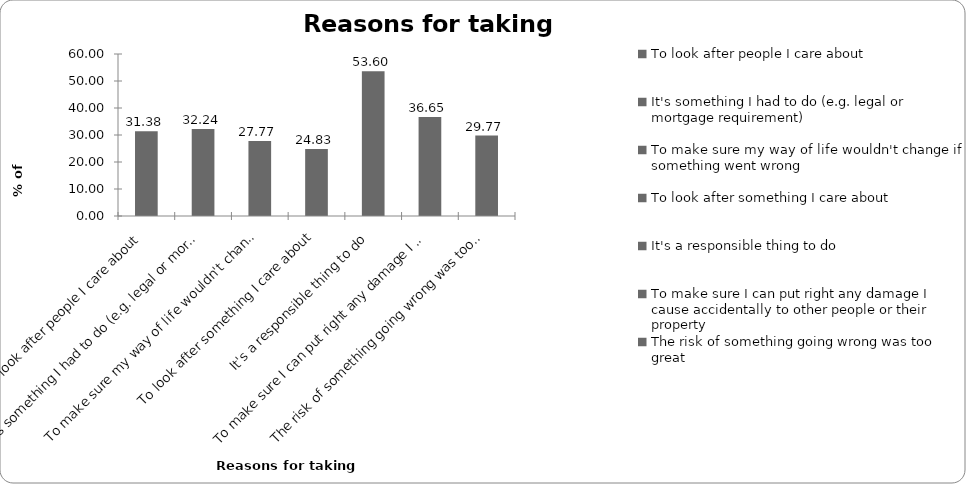
| Category | Reasons for taking insurance |
|---|---|
| To look after people I care about | 31.375 |
| It's something I had to do (e.g. legal or mortgage requirement) | 32.243 |
| To make sure my way of life wouldn't change if something went wrong | 27.77 |
| To look after something I care about | 24.833 |
| It's a responsible thing to do | 53.605 |
| To make sure I can put right any damage I cause accidentally to other people or their property | 36.649 |
| The risk of something going wrong was too great | 29.773 |